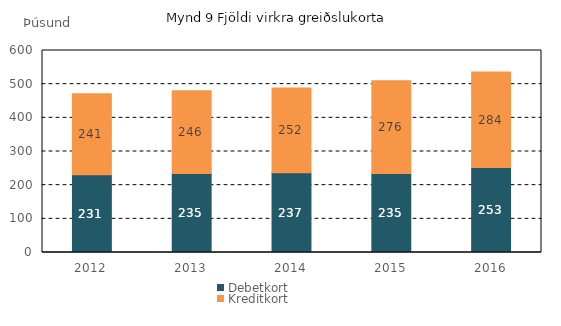
| Category | Debetkort | Kreditkort |
|---|---|---|
| 2012.0 | 231.18 | 240.647 |
| 2013.0 | 234.584 | 245.621 |
| 2014.0 | 236.524 | 251.8 |
| 2015.0 | 234.718 | 275.506 |
| 2016.0 | 252.54 | 283.905 |